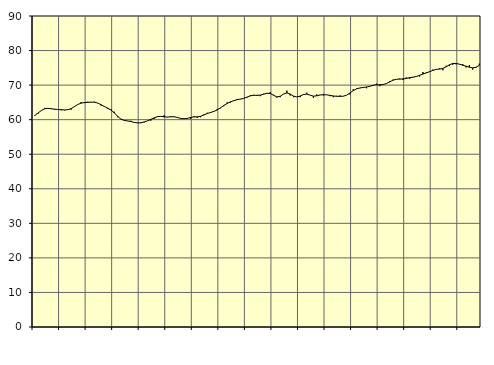
| Category | Piggar | Series 1 |
|---|---|---|
| nan | 61.3 | 61.18 |
| 87.0 | 61.7 | 61.9 |
| 87.0 | 62.6 | 62.64 |
| 87.0 | 63.4 | 63.15 |
| nan | 63.2 | 63.27 |
| 88.0 | 63.3 | 63.15 |
| 88.0 | 62.9 | 63.04 |
| 88.0 | 63 | 62.96 |
| nan | 62.7 | 62.88 |
| 89.0 | 62.7 | 62.81 |
| 89.0 | 62.8 | 62.88 |
| 89.0 | 62.9 | 63.21 |
| nan | 63.9 | 63.79 |
| 90.0 | 64.4 | 64.39 |
| 90.0 | 65.1 | 64.79 |
| 90.0 | 65.1 | 64.94 |
| nan | 65.2 | 65.01 |
| 91.0 | 65.1 | 65.07 |
| 91.0 | 65.2 | 65.05 |
| 91.0 | 64.8 | 64.81 |
| nan | 64.1 | 64.34 |
| 92.0 | 63.7 | 63.81 |
| 92.0 | 63.1 | 63.33 |
| 92.0 | 63 | 62.78 |
| nan | 62.3 | 61.96 |
| 93.0 | 60.7 | 60.97 |
| 93.0 | 60.1 | 60.18 |
| 93.0 | 59.9 | 59.79 |
| nan | 59.6 | 59.64 |
| 94.0 | 59.7 | 59.45 |
| 94.0 | 59.2 | 59.21 |
| 94.0 | 59 | 59.06 |
| nan | 59 | 59.11 |
| 95.0 | 59.2 | 59.34 |
| 95.0 | 59.7 | 59.66 |
| 95.0 | 59.7 | 60.08 |
| nan | 60.2 | 60.52 |
| 96.0 | 61 | 60.87 |
| 96.0 | 60.9 | 60.95 |
| 96.0 | 61.3 | 60.82 |
| nan | 60.7 | 60.76 |
| 97.0 | 61 | 60.83 |
| 97.0 | 60.8 | 60.85 |
| 97.0 | 60.7 | 60.64 |
| nan | 60.4 | 60.36 |
| 98.0 | 60.3 | 60.27 |
| 98.0 | 60.3 | 60.38 |
| 98.0 | 60.2 | 60.63 |
| nan | 61 | 60.79 |
| 99.0 | 60.5 | 60.82 |
| 99.0 | 60.7 | 60.97 |
| 99.0 | 61.5 | 61.35 |
| nan | 62 | 61.77 |
| 0.0 | 62.2 | 62.08 |
| 0.0 | 62.5 | 62.39 |
| 0.0 | 63.1 | 62.82 |
| nan | 63.3 | 63.42 |
| 1.0 | 63.9 | 64.1 |
| 1.0 | 65 | 64.69 |
| 1.0 | 64.9 | 65.15 |
| nan | 65.6 | 65.49 |
| 2.0 | 66 | 65.78 |
| 2.0 | 65.9 | 65.96 |
| 2.0 | 66.1 | 66.15 |
| nan | 66.4 | 66.53 |
| 3.0 | 67.1 | 66.9 |
| 3.0 | 67.2 | 67.05 |
| 3.0 | 66.9 | 67.04 |
| nan | 66.8 | 67.1 |
| 4.0 | 67.5 | 67.36 |
| 4.0 | 67.7 | 67.64 |
| 4.0 | 68 | 67.57 |
| nan | 67.2 | 67.05 |
| 5.0 | 66.4 | 66.59 |
| 5.0 | 66.5 | 66.78 |
| 5.0 | 67.4 | 67.43 |
| nan | 68.4 | 67.74 |
| 6.0 | 67 | 67.41 |
| 6.0 | 66.5 | 66.83 |
| 6.0 | 66.6 | 66.57 |
| nan | 66.5 | 66.83 |
| 7.0 | 67.4 | 67.29 |
| 7.0 | 67.8 | 67.4 |
| 7.0 | 67.1 | 67.08 |
| nan | 66.3 | 66.81 |
| 8.0 | 67.3 | 66.9 |
| 8.0 | 67.2 | 67.14 |
| 8.0 | 67 | 67.24 |
| nan | 67.2 | 67.18 |
| 9.0 | 66.8 | 67.03 |
| 9.0 | 66.5 | 66.86 |
| 9.0 | 66.9 | 66.76 |
| nan | 67 | 66.75 |
| 10.0 | 66.8 | 66.79 |
| 10.0 | 67.1 | 67.08 |
| 10.0 | 67.3 | 67.72 |
| nan | 68.8 | 68.41 |
| 11.0 | 69 | 68.91 |
| 11.0 | 69.1 | 69.18 |
| 11.0 | 69.4 | 69.32 |
| nan | 69.1 | 69.44 |
| 12.0 | 69.7 | 69.65 |
| 12.0 | 69.8 | 69.95 |
| 12.0 | 70.4 | 70.1 |
| nan | 69.7 | 70.09 |
| 13.0 | 70.2 | 70.15 |
| 13.0 | 70.5 | 70.46 |
| 13.0 | 71.2 | 70.95 |
| nan | 71.6 | 71.43 |
| 14.0 | 71.7 | 71.68 |
| 14.0 | 71.9 | 71.74 |
| 14.0 | 71.5 | 71.8 |
| nan | 72.2 | 71.94 |
| 15.0 | 71.8 | 72.15 |
| 15.0 | 72.2 | 72.3 |
| 15.0 | 72.6 | 72.49 |
| nan | 72.5 | 72.83 |
| 16.0 | 73.8 | 73.18 |
| 16.0 | 73.7 | 73.54 |
| 16.0 | 74 | 73.88 |
| nan | 74.5 | 74.26 |
| 17.0 | 74.5 | 74.54 |
| 17.0 | 74.9 | 74.65 |
| 17.0 | 74.3 | 74.82 |
| nan | 75.6 | 75.3 |
| 18.0 | 75.5 | 75.88 |
| 18.0 | 75.9 | 76.25 |
| 18.0 | 76 | 76.28 |
| nan | 76 | 76.06 |
| 19.0 | 76.1 | 75.75 |
| 19.0 | 75.1 | 75.48 |
| 19.0 | 75.8 | 75.19 |
| nan | 74.5 | 74.99 |
| 20.0 | 75 | 75.16 |
| 20.0 | 76.2 | 75.74 |